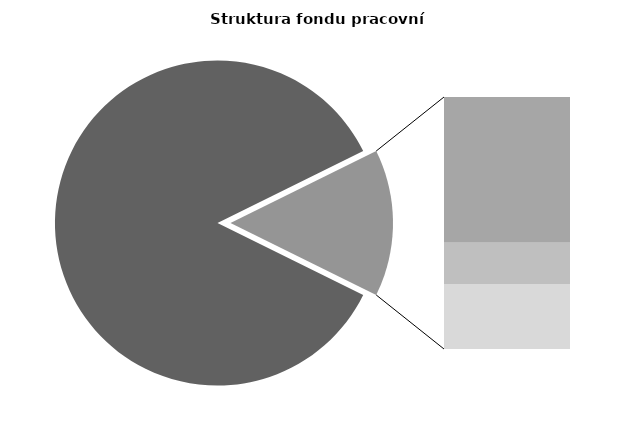
| Category | Series 0 |
|---|---|
| Průměrná měsíční odpracovaná doba bez přesčasu | 146.589 |
| Dovolená | 14.494 |
| Nemoc | 4.112 |
| Jiné | 6.463 |